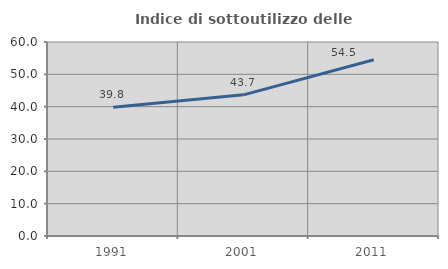
| Category | Indice di sottoutilizzo delle abitazioni  |
|---|---|
| 1991.0 | 39.831 |
| 2001.0 | 43.657 |
| 2011.0 | 54.525 |